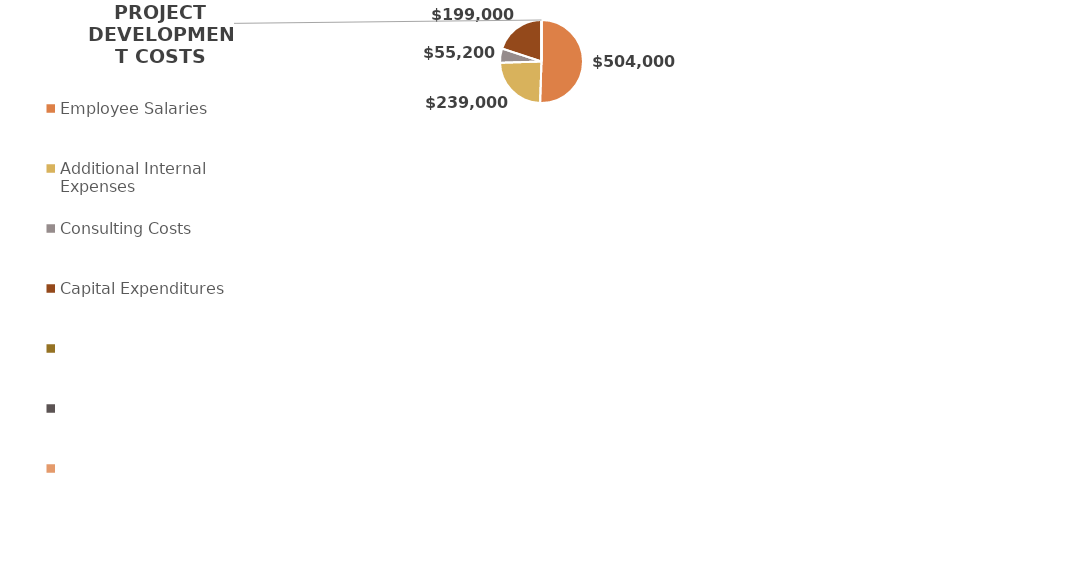
| Category | Series 0 |
|---|---|
| Employee Salaries | 504000 |
| Additional Internal Expenses | 239000 |
| Consulting Costs | 55200 |
| Capital Expenditures | 199000 |